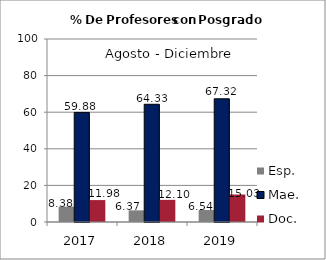
| Category | Esp. | Mae. | Doc. |
|---|---|---|---|
| 2017.0 | 8.38 | 59.88 | 11.98 |
| 2018.0 | 6.37 | 64.33 | 12.1 |
| 2019.0 | 6.54 | 67.32 | 15.03 |